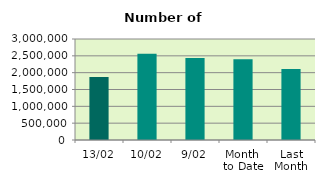
| Category | Series 0 |
|---|---|
| 13/02 | 1871594 |
| 10/02 | 2562732 |
| 9/02 | 2436682 |
| Month 
to Date | 2400310.222 |
| Last
Month | 2107310.455 |